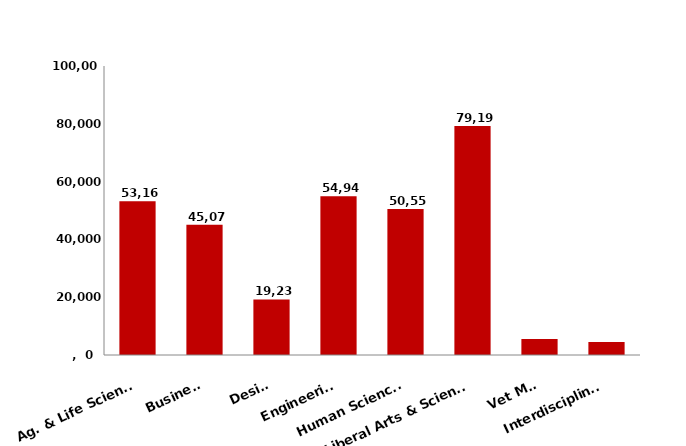
| Category | Series 0 |
|---|---|
| Ag. & Life Sciences | 53165 |
| Business | 45078 |
| Design | 19235 |
| Engineering | 54942 |
| Human Sciences | 50557 |
| Liberal Arts & Sciences | 79197 |
| Vet Med | 5564 |
| Interdisciplinary | 4459 |